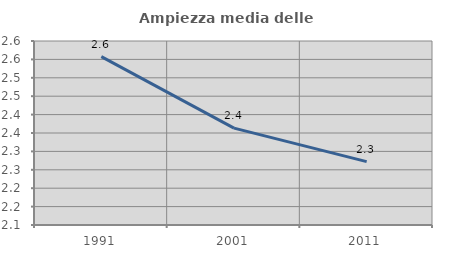
| Category | Ampiezza media delle famiglie |
|---|---|
| 1991.0 | 2.557 |
| 2001.0 | 2.363 |
| 2011.0 | 2.272 |